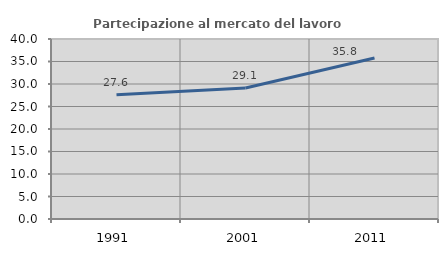
| Category | Partecipazione al mercato del lavoro  femminile |
|---|---|
| 1991.0 | 27.605 |
| 2001.0 | 29.107 |
| 2011.0 | 35.771 |